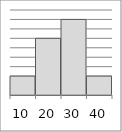
| Category | Series 1 |
|---|---|
| 10.0 | 2 |
| 20.0 | 6 |
| 30.0 | 8 |
| 40.0 | 2 |